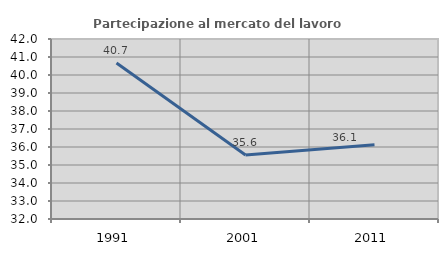
| Category | Partecipazione al mercato del lavoro  femminile |
|---|---|
| 1991.0 | 40.665 |
| 2001.0 | 35.558 |
| 2011.0 | 36.12 |